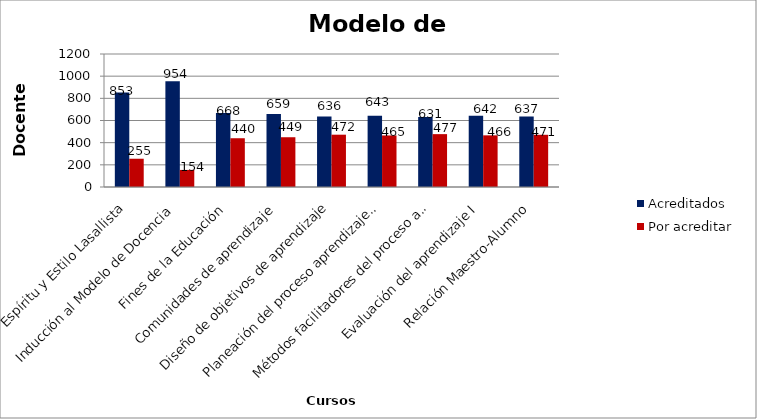
| Category | Acreditados | Por acreditar |
|---|---|---|
| Espíritu y Estilo Lasallista | 853 | 255 |
| Inducción al Modelo de Docencia | 954 | 154 |
| Fines de la Educación | 668 | 440 |
| Comunidades de aprendizaje | 659 | 449 |
| Diseño de objetivos de aprendizaje | 636 | 472 |
| Planeación del proceso aprendizaje-enseñanza I | 643 | 465 |
| Métodos facilitadores del proceso aprendizaje - enseñanza I | 631 | 477 |
| Evaluación del aprendizaje I | 642 | 466 |
| Relación Maestro-Alumno | 637 | 471 |